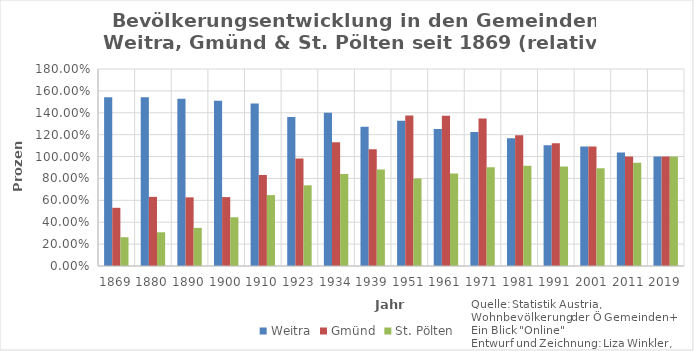
| Category | Weitra | Gmünd | St. Pölten |
|---|---|---|---|
| 1869.0 | 1.542 | 0.532 | 0.263 |
| 1880.0 | 1.542 | 0.632 | 0.308 |
| 1890.0 | 1.527 | 0.627 | 0.349 |
| 1900.0 | 1.509 | 0.63 | 0.445 |
| 1910.0 | 1.484 | 0.832 | 0.648 |
| 1923.0 | 1.362 | 0.982 | 0.737 |
| 1934.0 | 1.4 | 1.131 | 0.841 |
| 1939.0 | 1.272 | 1.066 | 0.883 |
| 1951.0 | 1.327 | 1.376 | 0.799 |
| 1961.0 | 1.251 | 1.374 | 0.845 |
| 1971.0 | 1.225 | 1.349 | 0.902 |
| 1981.0 | 1.167 | 1.195 | 0.916 |
| 1991.0 | 1.103 | 1.123 | 0.909 |
| 2001.0 | 1.092 | 1.091 | 0.892 |
| 2011.0 | 1.037 | 1 | 0.944 |
| 2019.0 | 1 | 1 | 1 |